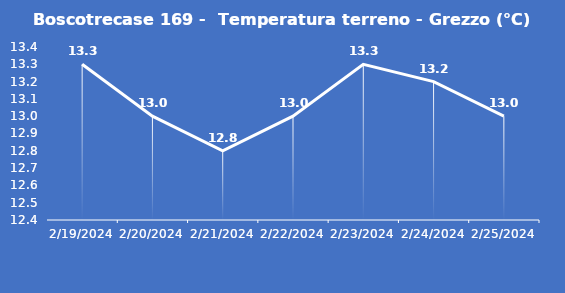
| Category | Boscotrecase 169 -  Temperatura terreno - Grezzo (°C) |
|---|---|
| 2/19/24 | 13.3 |
| 2/20/24 | 13 |
| 2/21/24 | 12.8 |
| 2/22/24 | 13 |
| 2/23/24 | 13.3 |
| 2/24/24 | 13.2 |
| 2/25/24 | 13 |